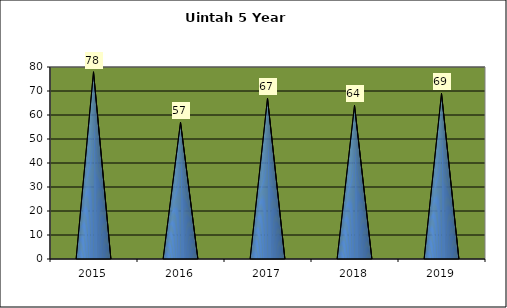
| Category | Washington Terrace April Comparison |
|---|---|
| 0 | 78 |
| 1 | 57 |
| 2 | 67 |
| 3 | 64 |
| 4 | 69 |